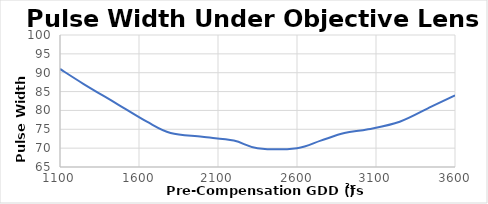
| Category | After Installing the FSPC17 Pulse Compressor |
|---|---|
| 1100.0 | 91 |
| 1250.0 | 87 |
| 1450.0 | 82 |
| 1650.0 | 77 |
| 1800.0 | 74 |
| 2000.0 | 73 |
| 2200.0 | 72 |
| 2350.0 | 70 |
| 2600.0 | 70 |
| 2750.0 | 72 |
| 2900.0 | 74 |
| 3050.0 | 75 |
| 3250.0 | 77 |
| 3450.0 | 81 |
| 3600.0 | 84 |